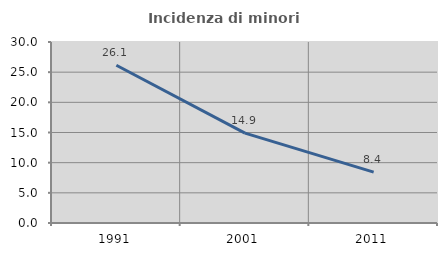
| Category | Incidenza di minori stranieri |
|---|---|
| 1991.0 | 26.144 |
| 2001.0 | 14.894 |
| 2011.0 | 8.438 |